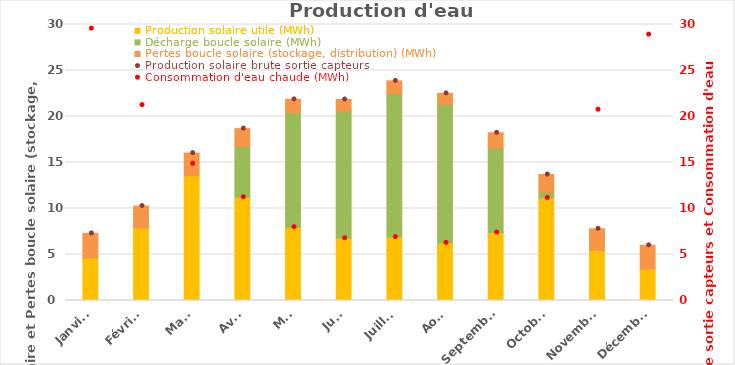
| Category | Production solaire utile (MWh) | Décharge boucle solaire (MWh) | Pertes boucle solaire (stockage, distribution) (MWh) |
|---|---|---|---|
| Janvier | 4.61 | 0 | 2.68 |
| Février | 7.89 | 0 | 2.38 |
| Mars | 13.55 | 0 | 2.47 |
| Avril | 11.23 | 5.54 | 1.91 |
| Mai | 7.97 | 12.45 | 1.44 |
| Juin | 6.76 | 13.84 | 1.25 |
| Juillet | 6.89 | 15.62 | 1.36 |
| Août | 6.26 | 15.06 | 1.19 |
| Septembre | 7.38 | 9.18 | 1.67 |
| Octobre | 11.15 | 0.62 | 1.92 |
| Novembre | 5.45 | 0 | 2.34 |
| Décembre | 3.42 | 0 | 2.58 |